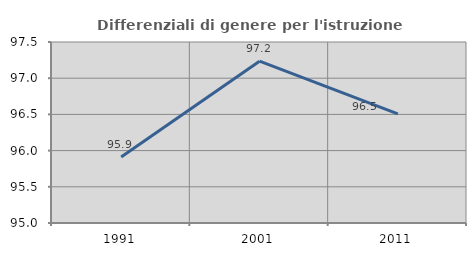
| Category | Differenziali di genere per l'istruzione superiore |
|---|---|
| 1991.0 | 95.913 |
| 2001.0 | 97.235 |
| 2011.0 | 96.508 |